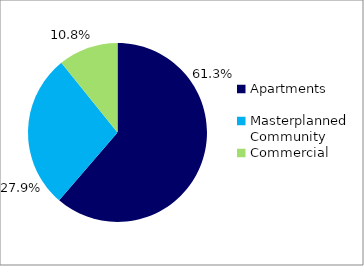
| Category | Series 0 |
|---|---|
| Apartments | 0.613 |
| Masterplanned Community | 0.279 |
| Commercial | 0.108 |